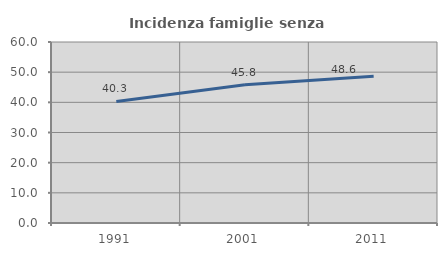
| Category | Incidenza famiglie senza nuclei |
|---|---|
| 1991.0 | 40.282 |
| 2001.0 | 45.83 |
| 2011.0 | 48.646 |